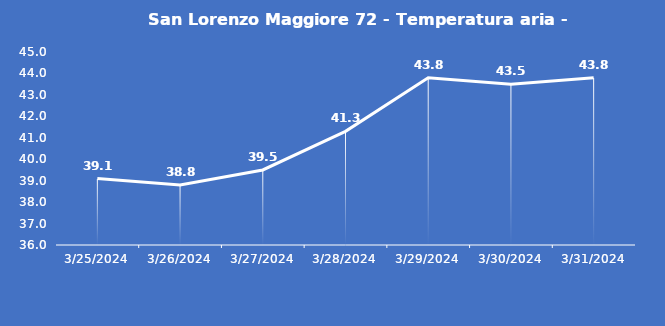
| Category | San Lorenzo Maggiore 72 - Temperatura aria - Grezzo (°C) |
|---|---|
| 3/25/24 | 39.1 |
| 3/26/24 | 38.8 |
| 3/27/24 | 39.5 |
| 3/28/24 | 41.3 |
| 3/29/24 | 43.8 |
| 3/30/24 | 43.5 |
| 3/31/24 | 43.8 |